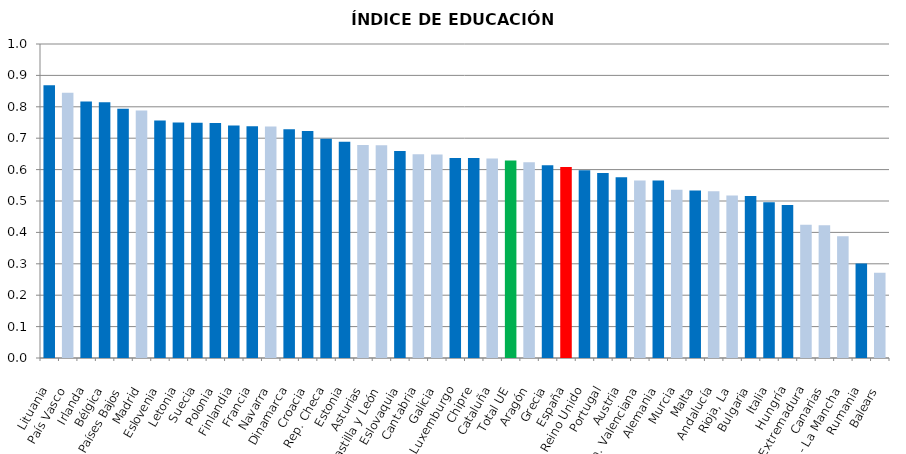
| Category | EDUCACIÓN19 |
|---|---|
| Lituania | 0.868 |
| País Vasco | 0.845 |
| Irlanda | 0.816 |
| Bélgica | 0.814 |
| Países Bajos | 0.794 |
| Madrid | 0.789 |
| Eslovenia | 0.757 |
| Letonia | 0.75 |
| Suecia | 0.749 |
| Polonia | 0.748 |
| Finlandia | 0.74 |
| Francia | 0.738 |
| Navarra | 0.737 |
| Dinamarca | 0.728 |
| Croacia | 0.723 |
| Rep. Checa | 0.698 |
| Estonia | 0.689 |
| Asturias | 0.679 |
| Castilla y León | 0.678 |
| Eslovaquia | 0.659 |
| Cantabria | 0.649 |
| Galicia | 0.648 |
| Luxemburgo | 0.637 |
| Chipre | 0.637 |
| Cataluña | 0.635 |
| Total UE | 0.629 |
| Aragón | 0.623 |
| Grecia | 0.614 |
| España | 0.608 |
| Reino Unido | 0.598 |
| Portugal | 0.589 |
| Austria | 0.575 |
| Com. Valenciana | 0.566 |
| Alemania | 0.565 |
| Murcia | 0.536 |
| Malta | 0.533 |
| Andalucía | 0.531 |
| Rioja, La | 0.518 |
| Bulgaria | 0.516 |
| Italia | 0.496 |
| Hungría | 0.487 |
| Extremadura | 0.424 |
| Canarias | 0.423 |
| Castilla - La Mancha | 0.388 |
| Rumania | 0.301 |
| Balears | 0.272 |